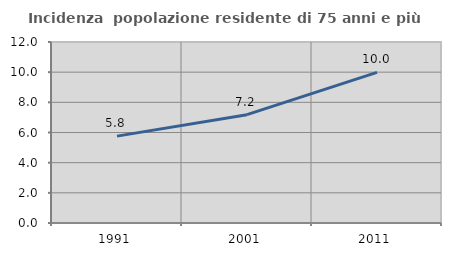
| Category | Incidenza  popolazione residente di 75 anni e più |
|---|---|
| 1991.0 | 5.76 |
| 2001.0 | 7.18 |
| 2011.0 | 9.985 |